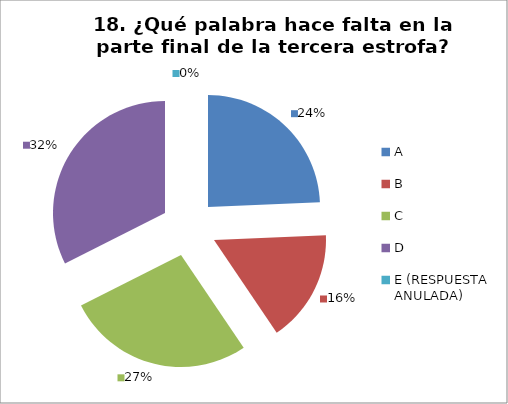
| Category | CANTIDAD DE RESPUESTAS PREGUNTA (18) | PORCENTAJE |
|---|---|---|
| A | 9 | 0.243 |
| B | 6 | 0.162 |
| C | 10 | 0.27 |
| D | 12 | 0.324 |
| E (RESPUESTA ANULADA) | 0 | 0 |